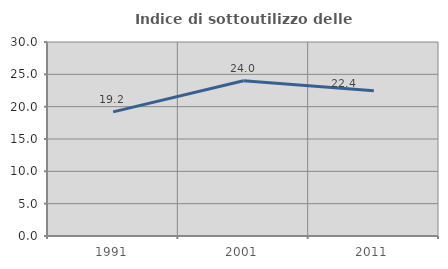
| Category | Indice di sottoutilizzo delle abitazioni  |
|---|---|
| 1991.0 | 19.195 |
| 2001.0 | 24.016 |
| 2011.0 | 22.449 |